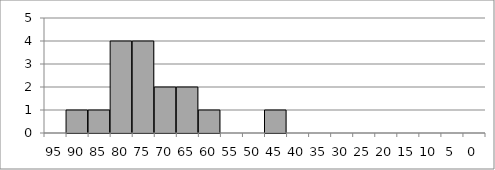
| Category | Series 1 |
|---|---|
| 95.0 | 0 |
| 90.0 | 1 |
| 85.0 | 1 |
| 80.0 | 4 |
| 75.0 | 4 |
| 70.0 | 2 |
| 65.0 | 2 |
| 60.0 | 1 |
| 55.0 | 0 |
| 50.0 | 0 |
| 45.0 | 1 |
| 40.0 | 0 |
| 35.0 | 0 |
| 30.0 | 0 |
| 25.0 | 0 |
| 20.0 | 0 |
| 15.0 | 0 |
| 10.0 | 0 |
| 5.0 | 0 |
| 0.0 | 0 |